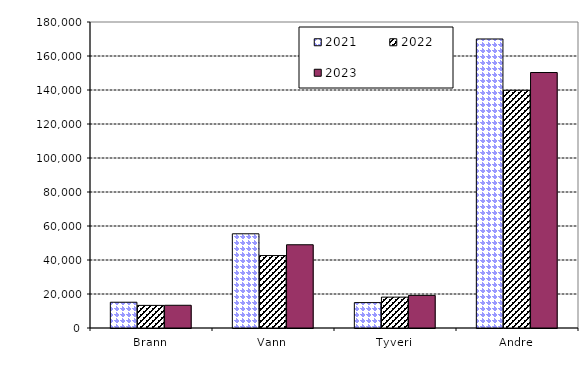
| Category | 2021 | 2022 | 2023 |
|---|---|---|---|
| Brann | 15152.745 | 13298.618 | 13372.053 |
| Vann | 55420.008 | 42614.573 | 48967.402 |
| Tyveri | 14942.034 | 18156.4 | 19189.678 |
| Andre | 170017.659 | 139810.908 | 150278.308 |